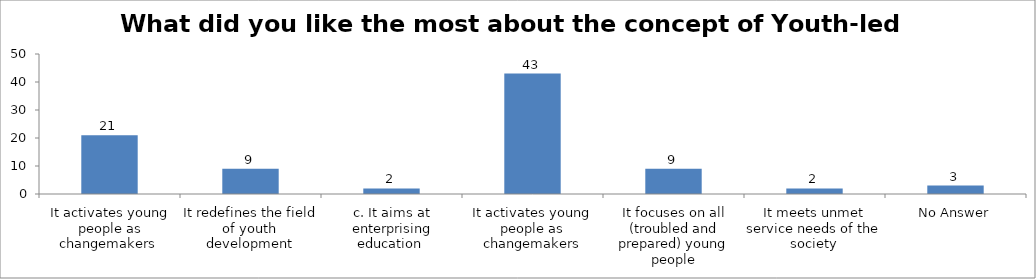
| Category | What did you like the most about the concept of Youth-led Changemaking? |
|---|---|
| It activates young people as changemakers  | 21 |
| It redefines the field of youth development | 9 |
| c. It aims at enterprising education  | 2 |
| It activates young people as changemakers | 43 |
| It focuses on all (troubled and prepared) young people | 9 |
| It meets unmet service needs of the society | 2 |
| No Answer | 3 |